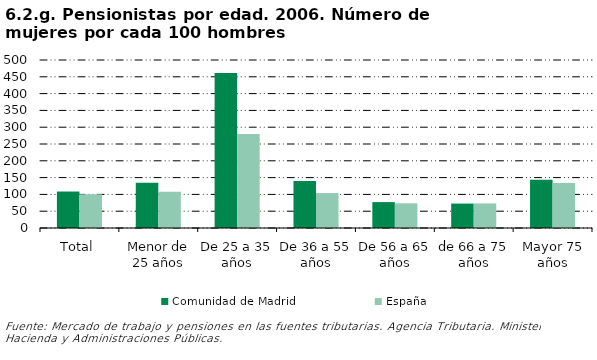
| Category | Comunidad de Madrid | España |
|---|---|---|
| Total | 108.57 | 100.42 |
| Menor de 25 años | 134.957 | 107.929 |
| De 25 a 35 años | 461.523 | 279.617 |
| De 36 a 55 años | 139.979 | 103.961 |
| De 56 a 65 años | 77.087 | 73.432 |
| de 66 a 75 años | 72.732 | 73.063 |
| Mayor 75 años | 143.6 | 133.899 |